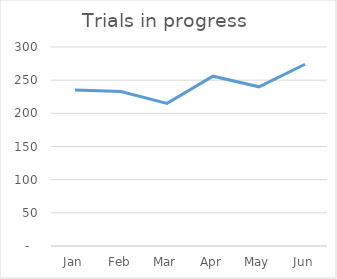
| Category | Trials in progress |
|---|---|
| Jan | 235 |
| Feb | 233 |
| Mar | 215 |
| Apr | 256 |
| May | 240 |
| Jun | 274 |